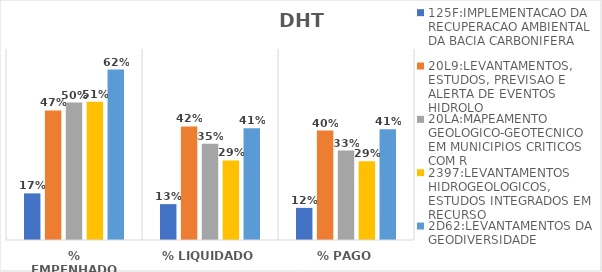
| Category | 125F:IMPLEMENTACAO DA RECUPERACAO AMBIENTAL DA BACIA CARBONIFERA | 20L9:LEVANTAMENTOS, ESTUDOS, PREVISAO E ALERTA DE EVENTOS HIDROLO | 20LA:MAPEAMENTO GEOLOGICO-GEOTECNICO EM MUNICIPIOS CRITICOS COM R | 2397:LEVANTAMENTOS HIDROGEOLOGICOS, ESTUDOS INTEGRADOS EM RECURSO | 2D62:LEVANTAMENTOS DA GEODIVERSIDADE |
|---|---|---|---|---|---|
| % EMPENHADO | 0.171 | 0.475 | 0.504 | 0.506 | 0.625 |
| % LIQUIDADO | 0.132 | 0.416 | 0.353 | 0.292 | 0.41 |
| % PAGO | 0.118 | 0.401 | 0.328 | 0.289 | 0.406 |